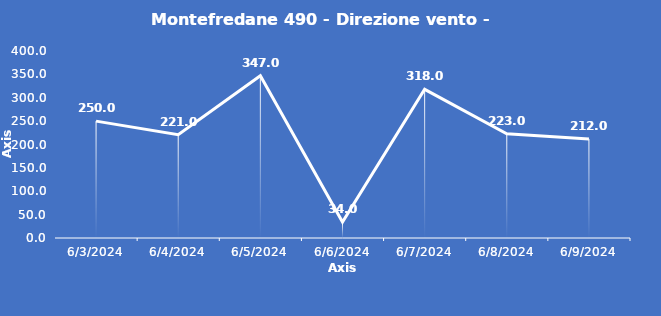
| Category | Montefredane 490 - Direzione vento - Grezzo (°N) |
|---|---|
| 6/3/24 | 250 |
| 6/4/24 | 221 |
| 6/5/24 | 347 |
| 6/6/24 | 34 |
| 6/7/24 | 318 |
| 6/8/24 | 223 |
| 6/9/24 | 212 |